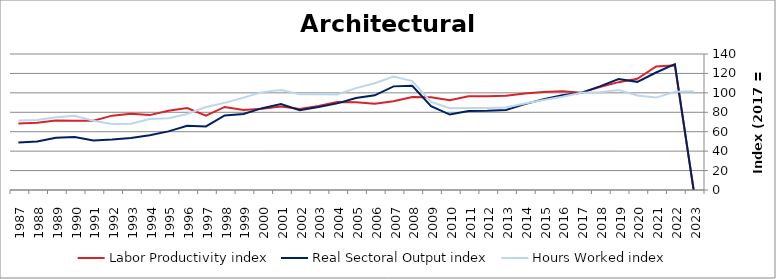
| Category | Labor Productivity index | Real Sectoral Output index | Hours Worked index |
|---|---|---|---|
| 2023.0 | 0 | 0 | 101.769 |
| 2022.0 | 128.285 | 129.607 | 101.031 |
| 2021.0 | 127.141 | 120.956 | 95.135 |
| 2020.0 | 114.538 | 111.336 | 97.204 |
| 2019.0 | 111.019 | 114.235 | 102.897 |
| 2018.0 | 106.037 | 106.728 | 100.652 |
| 2017.0 | 100 | 100 | 100 |
| 2016.0 | 101.564 | 97.592 | 96.089 |
| 2015.0 | 100.812 | 93.49 | 92.738 |
| 2014.0 | 99.221 | 88.399 | 89.093 |
| 2013.0 | 97.03 | 82.363 | 84.884 |
| 2012.0 | 96.592 | 81.617 | 84.496 |
| 2011.0 | 96.418 | 81.404 | 84.429 |
| 2010.0 | 92.346 | 77.659 | 84.095 |
| 2009.0 | 95.376 | 86.404 | 90.593 |
| 2008.0 | 95.717 | 107.328 | 112.131 |
| 2007.0 | 91.347 | 106.677 | 116.783 |
| 2006.0 | 88.67 | 97.489 | 109.945 |
| 2005.0 | 90.275 | 94.662 | 104.86 |
| 2004.0 | 90.661 | 89.17 | 98.355 |
| 2003.0 | 86.553 | 85.358 | 98.619 |
| 2002.0 | 83.316 | 82.052 | 98.483 |
| 2001.0 | 85.974 | 88.422 | 102.847 |
| 2000.0 | 83.61 | 84.247 | 100.763 |
| 1999.0 | 82.317 | 78.293 | 95.112 |
| 1998.0 | 85.506 | 76.681 | 89.679 |
| 1997.0 | 76.566 | 65.456 | 85.489 |
| 1996.0 | 84.416 | 66.101 | 78.304 |
| 1995.0 | 81.631 | 60.36 | 73.943 |
| 1994.0 | 77.098 | 56.257 | 72.968 |
| 1993.0 | 78.518 | 53.506 | 68.144 |
| 1992.0 | 76.53 | 51.918 | 67.84 |
| 1991.0 | 71.376 | 50.887 | 71.295 |
| 1990.0 | 71.309 | 54.51 | 76.443 |
| 1989.0 | 71.644 | 53.666 | 74.907 |
| 1988.0 | 69.124 | 49.858 | 72.128 |
| 1987.0 | 68.49 | 48.939 | 71.455 |